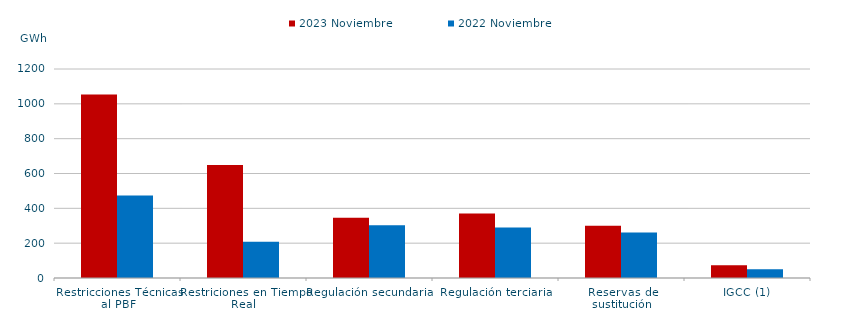
| Category | 2023 Noviembre | 2022 Noviembre |
|---|---|---|
| Restricciones Técnicas al PBF | 1053.58 | 474.283 |
| Restriciones en Tiempo Real | 648.545 | 208.129 |
| Regulación secundaria | 345.652 | 302.769 |
| Regulación terciaria | 370.485 | 289.98 |
| Reservas de sustitución | 299.708 | 260.753 |
| IGCC (1) | 73.691 | 49.858 |